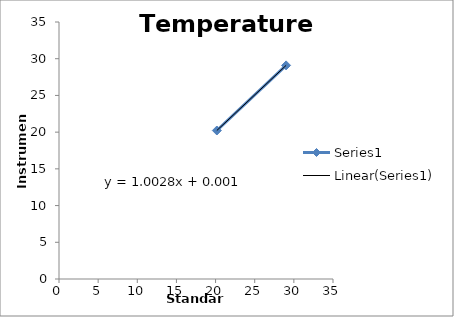
| Category | Series 0 |
|---|---|
| 29.009 | 29.092 |
| 20.164 | 20.222 |